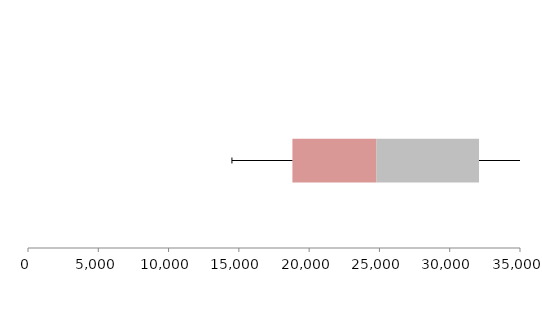
| Category | Series 1 | Series 2 | Series 3 |
|---|---|---|---|
| 0 | 18809.215 | 5984.86 | 7289.591 |